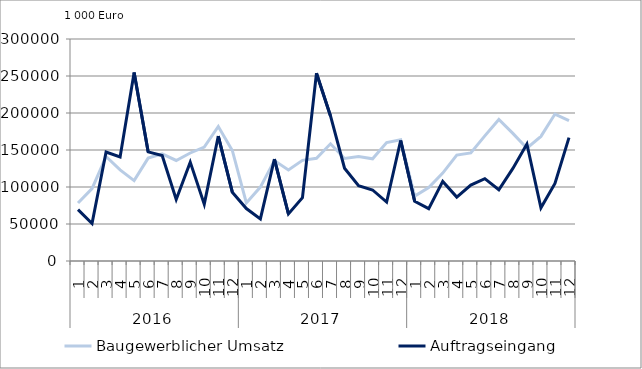
| Category | Baugewerblicher Umsatz | Auftragseingang |
|---|---|---|
| 0 | 78291.738 | 69470.357 |
| 1 | 97863.379 | 50640.033 |
| 2 | 141176.119 | 147206.65 |
| 3 | 123121.297 | 140579.009 |
| 4 | 108561.124 | 254739.334 |
| 5 | 139030.209 | 147481.644 |
| 6 | 144784.416 | 142609.658 |
| 7 | 135870.195 | 83192.156 |
| 8 | 145961.738 | 133594.351 |
| 9 | 153886.826 | 76793.838 |
| 10 | 181740.037 | 168867.568 |
| 11 | 149348.138 | 93011.853 |
| 12 | 78446.78 | 70908.903 |
| 13 | 99841.908 | 56868.408 |
| 14 | 135679.867 | 137790.423 |
| 15 | 123004.403 | 63637.761 |
| 16 | 136010.071 | 85644.63 |
| 17 | 138859.308 | 253791.552 |
| 18 | 158353.879 | 196034.198 |
| 19 | 138510.315 | 125319.873 |
| 20 | 141109.925 | 101690.626 |
| 21 | 138067.098 | 95966.626 |
| 22 | 160064.454 | 79701.993 |
| 23 | 163969.017 | 162878.607 |
| 24 | 87640.529 | 80684.627 |
| 25 | 99259.455 | 70746.763 |
| 26 | 118764.324 | 107538.747 |
| 27 | 143144.178 | 86374.619 |
| 28 | 146070.782 | 102661.329 |
| 29 | 169150.753 | 111287.709 |
| 30 | 191277.885 | 96286.662 |
| 31 | 172425.535 | 125142.495 |
| 32 | 152354.98 | 158112.302 |
| 33 | 168372.756 | 71808.619 |
| 34 | 198558.472 | 104904.147 |
| 35 | 189665.914 | 166653.461 |